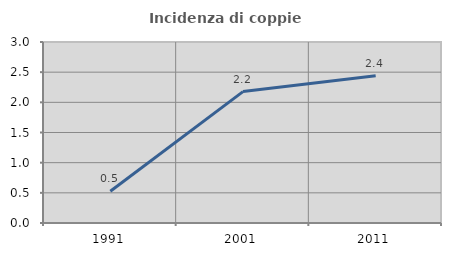
| Category | Incidenza di coppie miste |
|---|---|
| 1991.0 | 0.527 |
| 2001.0 | 2.178 |
| 2011.0 | 2.439 |